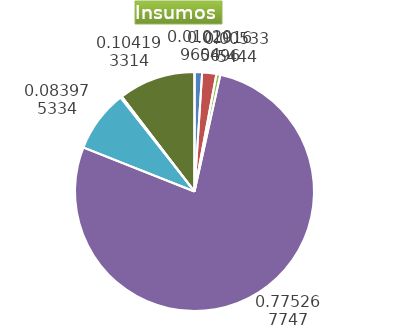
| Category | Series 0 |
|---|---|
| Control arvenses | 622100 |
| Control fitosanitario | 1167820 |
| Cosecha y beneficio | 325103.694 |
| Fertilización | 47239254 |
| Instalación | 5116854.331 |
| Otros | 112900 |
| Podas | 0 |
| Riego | 0 |
| Transporte | 6348793 |
| Tutorado | 0 |